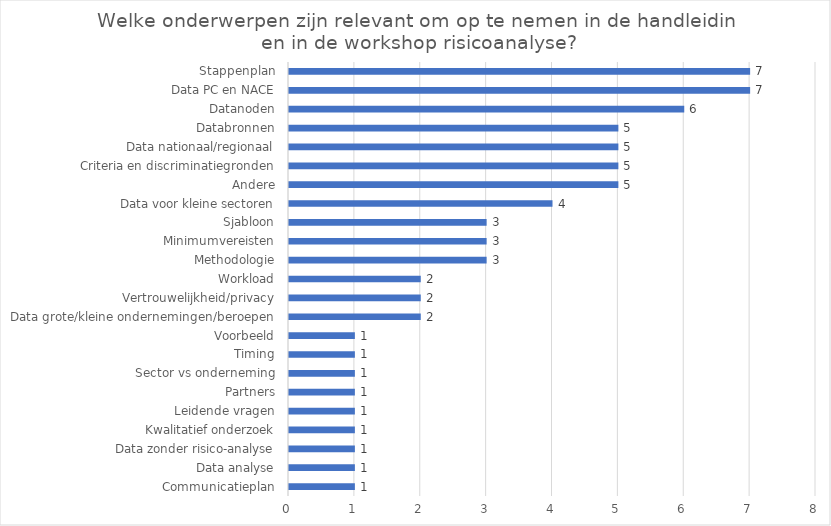
| Category | Aantal |
|---|---|
| Communicatieplan | 1 |
| Data analyse | 1 |
| Data zonder risico-analyse | 1 |
| Kwalitatief onderzoek | 1 |
| Leidende vragen | 1 |
| Partners | 1 |
| Sector vs onderneming | 1 |
| Timing | 1 |
| Voorbeeld | 1 |
| Data grote/kleine ondernemingen/beroepen | 2 |
| Vertrouwelijkheid/privacy | 2 |
| Workload | 2 |
| Methodologie | 3 |
| Minimumvereisten | 3 |
| Sjabloon | 3 |
| Data voor kleine sectoren | 4 |
| Andere | 5 |
| Criteria en discriminatiegronden | 5 |
| Data nationaal/regionaal | 5 |
| Databronnen | 5 |
| Datanoden | 6 |
| Data PC en NACE | 7 |
| Stappenplan | 7 |